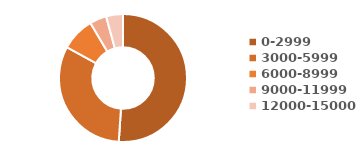
| Category | Monthly Average Income |
|---|---|
| 0-2999 | 24 |
| 3000-5999 | 15 |
| 6000-8999 | 4 |
| 9000-11999 | 2 |
| 12000-15000 | 2 |